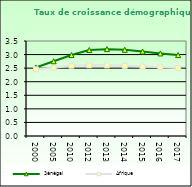
| Category | Sénégal | Afrique                        |
|---|---|---|
| 2000.0 | 2.526 | 2.458 |
| 2005.0 | 2.754 | 2.516 |
| 2010.0 | 2.982 | 2.59 |
| 2012.0 | 3.168 | 2.606 |
| 2013.0 | 3.2 | 2.601 |
| 2014.0 | 3.175 | 2.584 |
| 2015.0 | 3.113 | 2.559 |
| 2016.0 | 3.042 | 2.531 |
| 2017.0 | 2.981 | 2.503 |